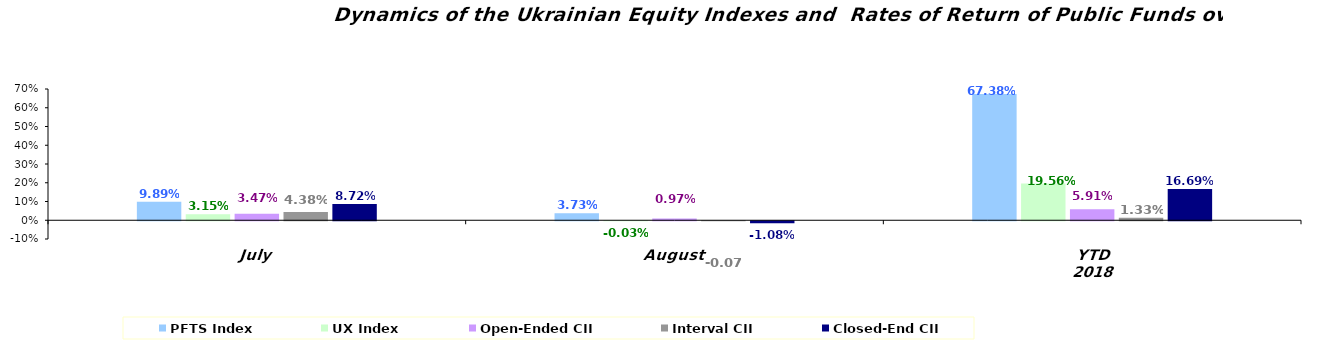
| Category | PFTS Index | UX Index | Open-Ended CII | Interval CII | Closed-End CII |
|---|---|---|---|---|---|
| July | 0.099 | 0.031 | 0.035 | 0.044 | 0.087 |
| August | 0.037 | 0 | 0.01 | -0.001 | -0.011 |
| YTD 2018 | 0.674 | 0.196 | 0.059 | 0.013 | 0.167 |